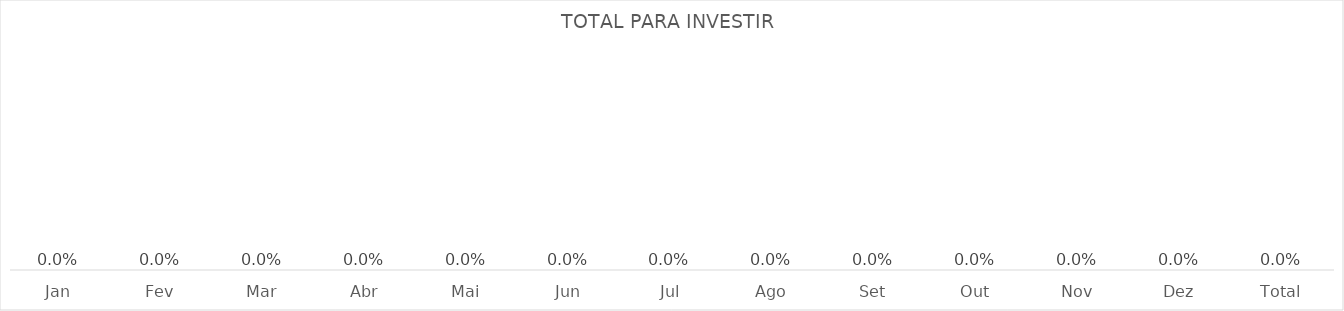
| Category | TOTAL PARA INVESTIR |
|---|---|
|  Jan  | 0 |
|  Fev  | 0 |
|  Mar  | 0 |
|  Abr  | 0 |
|  Mai  | 0 |
|  Jun  | 0 |
|  Jul  | 0 |
|  Ago  | 0 |
|  Set  | 0 |
|  Out  | 0 |
|  Nov  | 0 |
|  Dez  | 0 |
|  Total  | 0 |